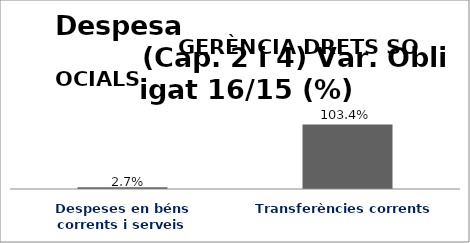
| Category | Series 0 |
|---|---|
| Despeses en béns corrents i serveis | 0.027 |
| Transferències corrents | 1.034 |